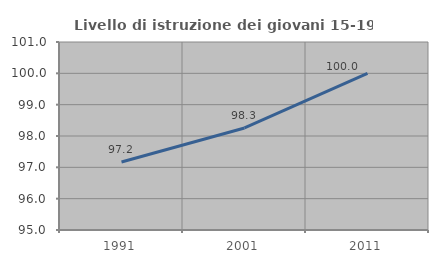
| Category | Livello di istruzione dei giovani 15-19 anni |
|---|---|
| 1991.0 | 97.17 |
| 2001.0 | 98.256 |
| 2011.0 | 100 |